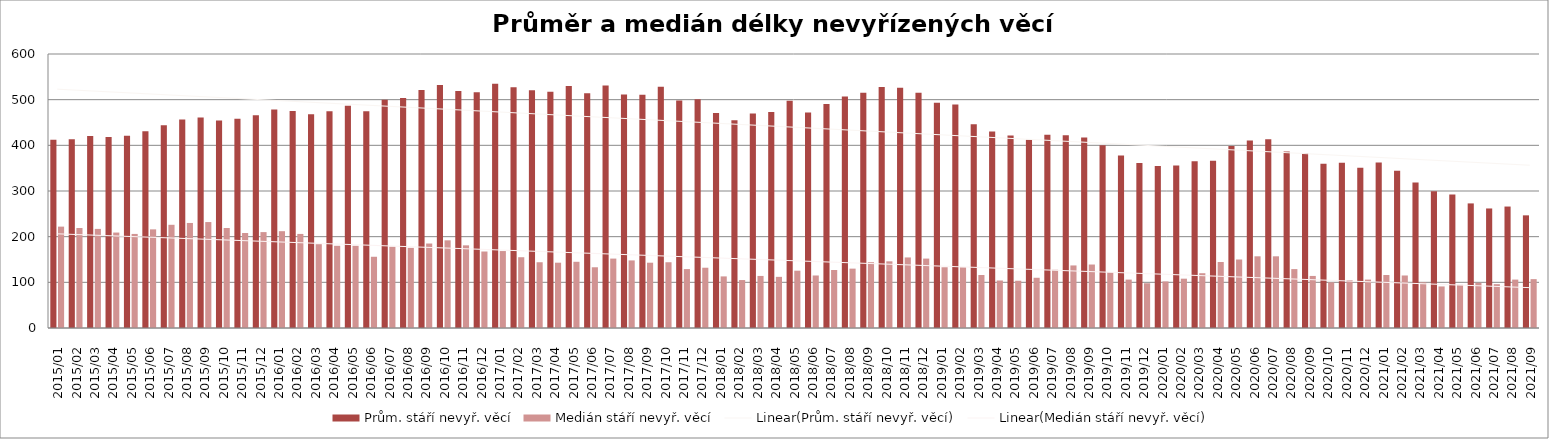
| Category | Prům. stáří nevyř. věcí | Medián stáří nevyř. věcí |
|---|---|---|
| 2015/01 | 412.41 | 222 |
| 2015/02 | 413.18 | 219 |
| 2015/03 | 420.27 | 217 |
| 2015/04 | 418.17 | 209 |
| 2015/05 | 420.85 | 206 |
| 2015/06 | 430.74 | 216 |
| 2015/07 | 443.84 | 226 |
| 2015/08 | 456.4 | 230 |
| 2015/09 | 461.03 | 232 |
| 2015/10 | 454.63 | 219 |
| 2015/11 | 458.15 | 208 |
| 2015/12 | 465.86 | 210 |
| 2016/01 | 478.64 | 212 |
| 2016/02 | 475.06 | 206 |
| 2016/03 | 467.87 | 183.5 |
| 2016/04 | 474.55 | 180 |
| 2016/05 | 486.72 | 180 |
| 2016/06 | 474.69 | 156 |
| 2016/07 | 500 | 178 |
| 2016/08 | 503.38 | 175.5 |
| 2016/09 | 521.03 | 185 |
| 2016/10 | 531.95 | 192 |
| 2016/11 | 519.25 | 181 |
| 2016/12 | 516.01 | 167.5 |
| 2017/01 | 534.78 | 168.5 |
| 2017/02 | 527.06 | 155 |
| 2017/03 | 520.43 | 144 |
| 2017/04 | 517.51 | 143 |
| 2017/05 | 530 | 145 |
| 2017/06 | 513.94 | 133 |
| 2017/07 | 531.28 | 152 |
| 2017/08 | 511.25 | 148 |
| 2017/09 | 510.94 | 143 |
| 2017/10 | 528.05 | 144 |
| 2017/11 | 498.27 | 129 |
| 2017/12 | 500.64 | 132 |
| 2018/01 | 471.03 | 113 |
| 2018/02 | 454.99 | 105 |
| 2018/03 | 469.85 | 114 |
| 2018/04 | 473.26 | 112 |
| 2018/05 | 497.89 | 125.5 |
| 2018/06 | 471.99 | 115 |
| 2018/07 | 490.78 | 127 |
| 2018/08 | 506.74 | 130 |
| 2018/09 | 515.38 | 144 |
| 2018/10 | 527.47 | 146 |
| 2018/11 | 526.3 | 154.5 |
| 2018/12 | 515.07 | 152 |
| 2019/01 | 493.37 | 133 |
| 2019/02 | 489.66 | 133 |
| 2019/03 | 446.11 | 116 |
| 2019/04 | 430.02 | 104 |
| 2019/05 | 421.64 | 103.5 |
| 2019/06 | 412.4 | 110 |
| 2019/07 | 423.08 | 127.5 |
| 2019/08 | 421.9 | 137 |
| 2019/09 | 417.05 | 139 |
| 2019/10 | 400.23 | 122 |
| 2019/11 | 378 | 106 |
| 2019/12 | 361.08 | 98 |
| 2020/01 | 354.49 | 102 |
| 2020/02 | 356.06 | 108 |
| 2020/03 | 365.37 | 120 |
| 2020/04 | 366.34 | 144.5 |
| 2020/05 | 398.68 | 150 |
| 2020/06 | 410.4 | 157 |
| 2020/07 | 413.34 | 157 |
| 2020/08 | 386.33 | 129 |
| 2020/09 | 382.62 | 114 |
| 2020/10 | 359.66 | 100 |
| 2020/11 | 361.76 | 105 |
| 2020/12 | 350.77 | 106 |
| 2021/01 | 362.18 | 116 |
| 2021/02 | 344.38 | 115 |
| 2021/03 | 318.39 | 100 |
| 2021/04 | 299.54 | 91 |
| 2021/05 | 292.26 | 94.5 |
| 2021/06 | 272.83 | 99 |
| 2021/07 | 261.76 | 96 |
| 2021/08 | 265.97 | 106 |
| 2021/09 | 246.69 | 107 |